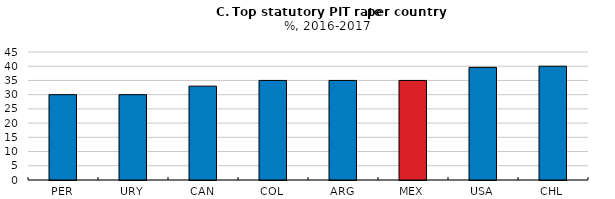
| Category | Number of tax thresholds |
|---|---|
| PER | 30 |
| URY | 30 |
| CAN | 33 |
| COL | 35 |
| ARG | 35 |
| MEX | 35 |
| USA | 39.6 |
| CHL | 40 |